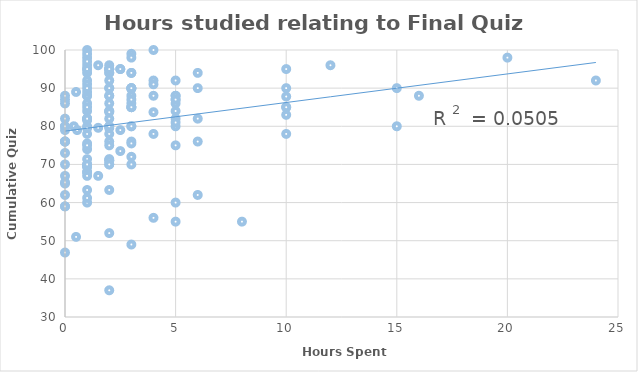
| Category | Series 0 |
|---|---|
| 6.0 | 76 |
| 0.4 | 80 |
| 0.0 | 76 |
| 1.0 | 88 |
| 10.0 | 78 |
| 1.0 | 100 |
| 15.0 | 80 |
| 5.0 | 86 |
| 1.0 | 82 |
| 0.55 | 79 |
| 1.0 | 70 |
| 1.0 | 86 |
| 2.0 | 92 |
| 6.0 | 90 |
| 2.0 | 94 |
| 0.0 | 76 |
| 2.0 | 82 |
| 1.5 | 96 |
| 2.0 | 84 |
| 0.5 | 89 |
| 2.0 | 88 |
| 6.0 | 62 |
| 24.0 | 92 |
| 1.0 | 80 |
| 2.0 | 84 |
| 2.0 | 88 |
| 1.5 | 67 |
| 3.0 | 90 |
| 10.0 | 83 |
| 6.0 | 82 |
| 20.0 | 98 |
| 2.0 | 90 |
| 5.0 | 88 |
| 5.0 | 84 |
| 0.0 | 82 |
| 1.0 | 94 |
| 1.0 | 78 |
| 5.0 | 80 |
| 2.0 | 80 |
| 3.0 | 94 |
| 5.0 | 88 |
| 1.0 | 88 |
| 1.0 | 84 |
| 3.0 | 86 |
| 4.0 | 92 |
| 3.0 | 88 |
| 0.0 | 87 |
| 1.0 | 92 |
| 16.0 | 88 |
| 0.0 | 70 |
| 5.0 | 82 |
| 6.0 | 94 |
| 1.0 | 68 |
| 1.0 | 82 |
| 2.0 | 78 |
| 2.0 | 76 |
| 4.0 | 78 |
| 5.0 | 87 |
| 0.0 | 65 |
| 5.0 | 87 |
| 3.0 | 49 |
| 3.0 | 76 |
| 2.0 | 86 |
| 2.0 | 94 |
| 4.0 | 91 |
| 12.0 | 96 |
| 10.0 | 85 |
| 5.0 | 60 |
| 1.0 | 68 |
| 2.0 | 52 |
| 5.0 | 81 |
| 2.0 | 96 |
| 1.0 | 60 |
| 2.0 | 37 |
| 4.0 | 88 |
| 3.0 | 72 |
| 5.0 | 92 |
| 0.0 | 62 |
| 1.0 | 61.2 |
| 1.0 | 63.3 |
| 1.0 | 81.6 |
| 1.0 | 96 |
| 1.0 | 69.4 |
| 3.0 | 75.5 |
| 2.5 | 73.5 |
| 10.0 | 87.8 |
| 0.0 | 59 |
| 1.0 | 69.4 |
| 0.0 | 46.9 |
| 2.0 | 83.7 |
| 4.0 | 83.7 |
| 0.5 | 51 |
| 2.0 | 63.3 |
| 2.0 | 71.4 |
| 1.5 | 79.6 |
| 1.0 | 98 |
| 3.0 | 89.8 |
| 1.0 | 71.4 |
| 1.0 | 79.5 |
| 1.0 | 75.5 |
| 0.0 | 65.3 |
| 2.0 | 79.5 |
| 0.0 | 79 |
| 10.0 | 85 |
| 2.5 | 79 |
| 3.0 | 85 |
| 0.0 | 73 |
| 8.0 | 55 |
| 1.0 | 74 |
| 1.0 | 97 |
| 1.0 | 91 |
| 3.0 | 99 |
| 10.0 | 102 |
| 1.0 | 89 |
| 0.0 | 86 |
| 1.0 | 99 |
| 2.0 | 75 |
| 2.0 | 71 |
| 1.0 | 70 |
| 0.0 | 67 |
| 0.0 | 59 |
| 1.0 | 67 |
| 1.0 | 90 |
| 4.0 | 56 |
| 2.0 | 71 |
| 3.0 | 87 |
| 3.0 | 98 |
| 0.0 | 88 |
| 0.0 | 76 |
| 1.0 | 82 |
| 3.0 | 94 |
| 3.0 | 80 |
| 2.0 | 70 |
| 2.0 | 70 |
| 3.0 | 80 |
| 1.0 | 75 |
| 2.0 | 95 |
| 5.0 | 75 |
| 10.0 | 90 |
| 2.0 | 90 |
| 2.0 | 95 |
| 2.0 | 80 |
| 0.0 | 80 |
| 1.0 | 85 |
| 3.0 | 90 |
| 3.0 | 85 |
| 15.0 | 90 |
| 2.0 | 95 |
| 5.0 | 55 |
| 2.5 | 95 |
| 3.0 | 85 |
| 3.0 | 70 |
| 1.0 | 95 |
| 10.0 | 95 |
| 0.0 | 80 |
| 2.0 | 95 |
| 2.5 | 95 |
| 3.0 | 90 |
| 1.0 | 95 |
| 4.0 | 100 |